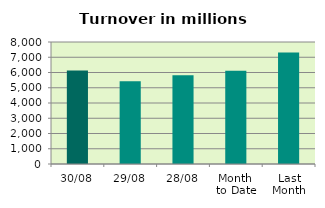
| Category | Series 0 |
|---|---|
| 30/08 | 6137.702 |
| 29/08 | 5419.29 |
| 28/08 | 5825.305 |
| Month 
to Date | 6118.733 |
| Last
Month | 7313.522 |